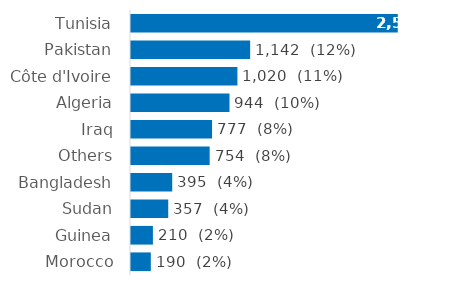
| Category | Series 0 |
|---|---|
| Tunisia | 2557 |
| Pakistan | 1142 |
| Côte d'Ivoire | 1020 |
| Algeria | 944 |
| Iraq | 777 |
| Others | 754 |
| Bangladesh | 395 |
| Sudan | 357 |
| Guinea | 210 |
| Morocco | 190 |